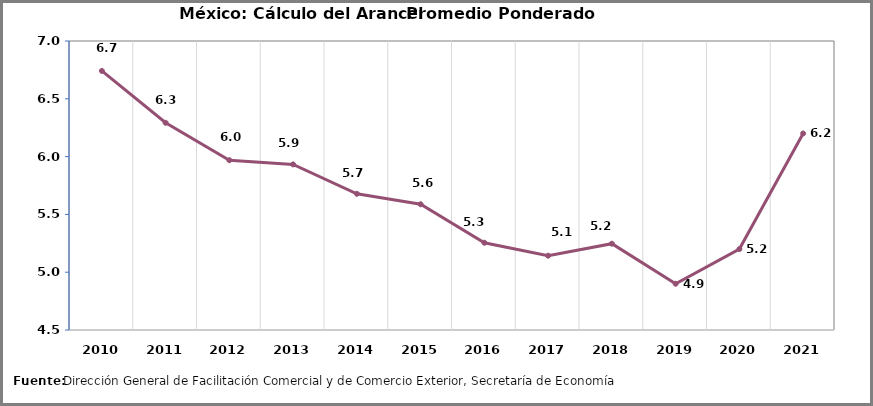
| Category | Series 0 |
|---|---|
| 2010.0 | 6.741 |
| 2011.0 | 6.293 |
| 2012.0 | 5.969 |
| 2013.0 | 5.933 |
| 2014.0 | 5.678 |
| 2015.0 | 5.588 |
| 2016.0 | 5.255 |
| 2017.0 | 5.143 |
| 2018.0 | 5.246 |
| 2019.0 | 4.9 |
| 2020.0 | 5.2 |
| 2021.0 | 6.2 |